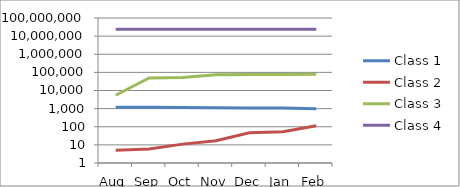
| Category | Class 1 | Class 2 | Class 3 | Class 4 |
|---|---|---|---|---|
| Aug | 1187 | 5 | 5487 | 23954318 |
| Sep | 1184 | 6 | 49493 | 23932519 |
| Oct | 1160 | 11 | 51752 | 23944918 |
| Nov | 1131 | 17 | 74030 | 23941127 |
| Dec | 1078 | 46 | 75711 | 23957573 |
| Jan | 1067 | 53 | 76685 | 23972323 |
| Feb | 990 | 115 | 78345 | 23986004 |